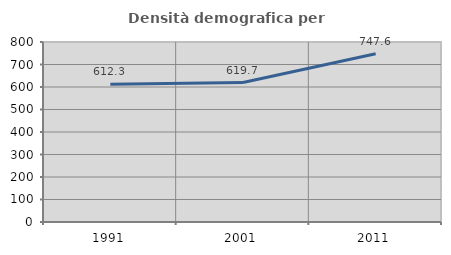
| Category | Densità demografica |
|---|---|
| 1991.0 | 612.26 |
| 2001.0 | 619.715 |
| 2011.0 | 747.584 |